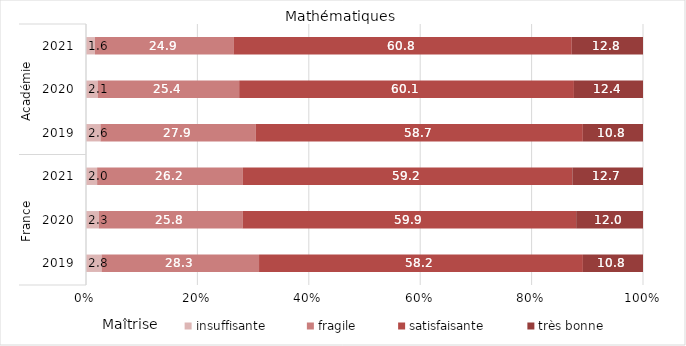
| Category | insuffisante | fragile | satisfaisante | très bonne |
|---|---|---|---|---|
| 0 | 2.8 | 28.3 | 58.2 | 10.8 |
| 1 | 2.3 | 25.8 | 59.9 | 12 |
| 2 | 2 | 26.2 | 59.2 | 12.7 |
| 3 | 2.6 | 27.9 | 58.7 | 10.8 |
| 4 | 2.1 | 25.4 | 60.1 | 12.4 |
| 5 | 1.6 | 24.9 | 60.8 | 12.8 |